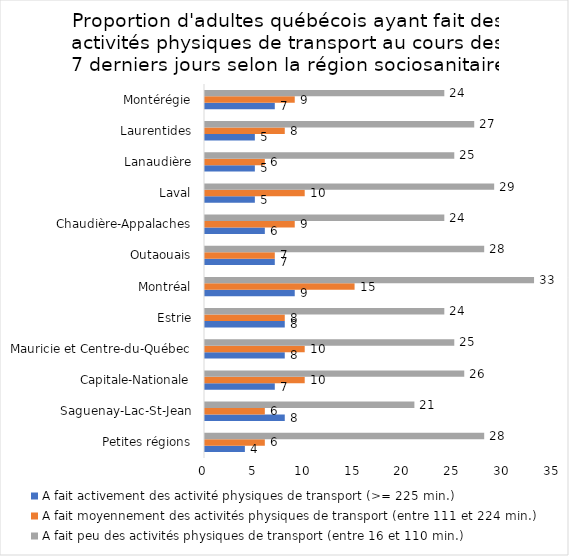
| Category | A fait activement des activité physiques de transport (>= 225 min.) | A fait moyennement des activités physiques de transport (entre 111 et 224 min.) | A fait peu des activités physiques de transport (entre 16 et 110 min.) |
|---|---|---|---|
| Petites régions | 4 | 6 | 28 |
| Saguenay-Lac-St-Jean | 8 | 6 | 21 |
| Capitale-Nationale | 7 | 10 | 26 |
| Mauricie et Centre-du-Québec | 8 | 10 | 25 |
| Estrie | 8 | 8 | 24 |
| Montréal | 9 | 15 | 33 |
| Outaouais | 7 | 7 | 28 |
| Chaudière-Appalaches | 6 | 9 | 24 |
| Laval | 5 | 10 | 29 |
| Lanaudière | 5 | 6 | 25 |
| Laurentides | 5 | 8 | 27 |
| Montérégie | 7 | 9 | 24 |